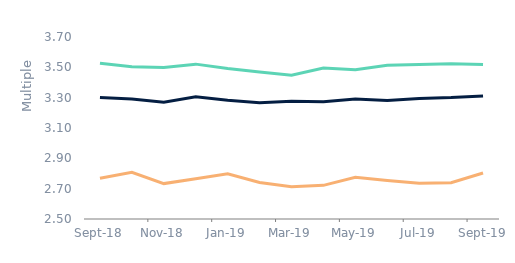
| Category | First-time
buyers | Homemovers | Remortgagors |
|---|---|---|---|
| 2018-09-01 | 3.528 | 3.302 | 2.769 |
| 2018-10-01 | 3.504 | 3.292 | 2.808 |
| 2018-11-01 | 3.5 | 3.27 | 2.733 |
| 2018-12-01 | 3.521 | 3.305 | 2.766 |
| 2019-01-01 | 3.493 | 3.283 | 2.798 |
| 2019-02-01 | 3.47 | 3.267 | 2.74 |
| 2019-03-01 | 3.447 | 3.276 | 2.713 |
| 2019-04-01 | 3.495 | 3.274 | 2.722 |
| 2019-05-01 | 3.484 | 3.291 | 2.775 |
| 2019-06-01 | 3.514 | 3.282 | 2.754 |
| 2019-07-01 | 3.519 | 3.295 | 2.736 |
| 2019-08-01 | 3.524 | 3.3 | 2.739 |
| 2019-09-01 | 3.519 | 3.311 | 2.804 |